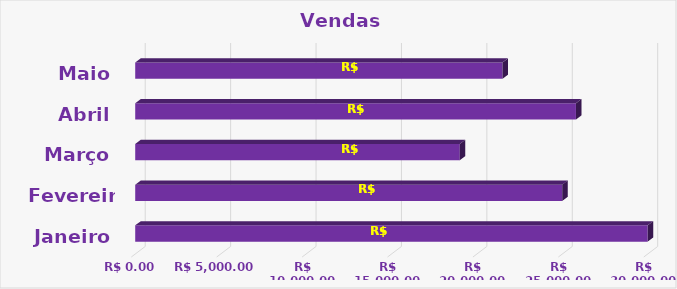
| Category | Vendas |
|---|---|
| Janeiro | 30000 |
| Fevereiro | 25000 |
| Março | 19000 |
| Abril | 25800 |
| Maio | 21500 |